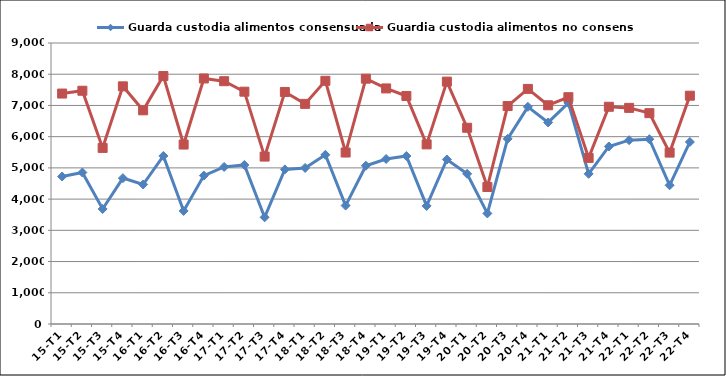
| Category | Guarda custodia alimentos consensuada | Guardia custodia alimentos no consensuada |
|---|---|---|
| 15-T1 | 4724 | 7381 |
| 15-T2 | 4852 | 7471 |
| 15-T3 | 3684 | 5640 |
| 15-T4 | 4672 | 7612 |
| 16-T1 | 4468 | 6844 |
| 16-T2 | 5382 | 7942 |
| 16-T3 | 3622 | 5748 |
| 16-T4 | 4753 | 7864 |
| 17-T1 | 5030 | 7776 |
| 17-T2 | 5094 | 7441 |
| 17-T3 | 3417 | 5362 |
| 17-T4 | 4951 | 7432 |
| 18-T1 | 4998 | 7050 |
| 18-T2 | 5420 | 7789 |
| 18-T3 | 3793 | 5492 |
| 18-T4 | 5070 | 7857 |
| 19-T1 | 5285 | 7545 |
| 19-T2 | 5380 | 7303 |
| 19-T3 | 3782 | 5753 |
| 19-T4 | 5269 | 7763 |
| 20-T1 | 4809 | 6286 |
| 20-T2 | 3542 | 4387 |
| 20-T3 | 5930 | 6981 |
| 20-T4 | 6955 | 7530 |
| 21-T1 | 6456 | 7006 |
| 21-T2 | 7080 | 7264 |
| 21-T3 | 4810 | 5320 |
| 21-T4 | 5686 | 6958 |
| 22-T1 | 5888 | 6922 |
| 22-T2 | 5919 | 6753 |
| 22-T3 | 4443 | 5489 |
| 22-T4 | 5831 | 7312 |